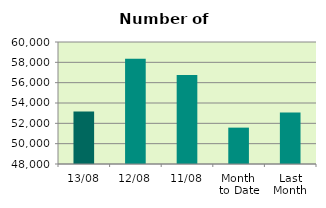
| Category | Series 0 |
|---|---|
| 13/08 | 53168 |
| 12/08 | 58362 |
| 11/08 | 56744 |
| Month 
to Date | 51576.889 |
| Last
Month | 53071.913 |